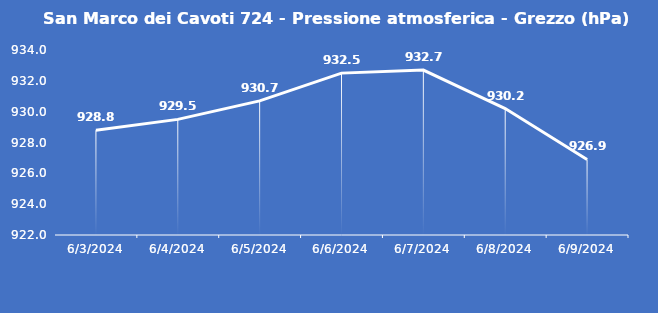
| Category | San Marco dei Cavoti 724 - Pressione atmosferica - Grezzo (hPa) |
|---|---|
| 6/3/24 | 928.8 |
| 6/4/24 | 929.5 |
| 6/5/24 | 930.7 |
| 6/6/24 | 932.5 |
| 6/7/24 | 932.7 |
| 6/8/24 | 930.2 |
| 6/9/24 | 926.9 |